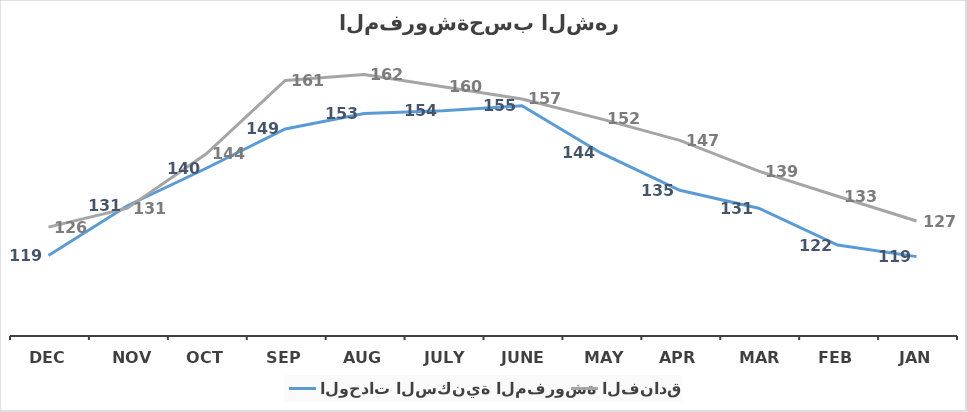
| Category | الوحدات السكنية المفروشة | الفنادق |
|---|---|---|
| Jan | 118.966 | 127.472 |
| Feb | 121.719 | 133.377 |
| Mar | 130.537 | 139.401 |
| Apr | 134.804 | 146.751 |
| May | 143.731 | 151.871 |
| June | 155.011 | 156.634 |
| July | 153.818 | 159.56 |
| Aug | 153.133 | 162.444 |
| Sep | 149.462 | 161.054 |
| Oct | 140.077 | 143.542 |
| Nov | 131.12 | 130.536 |
| Dec | 119.24 | 126.003 |